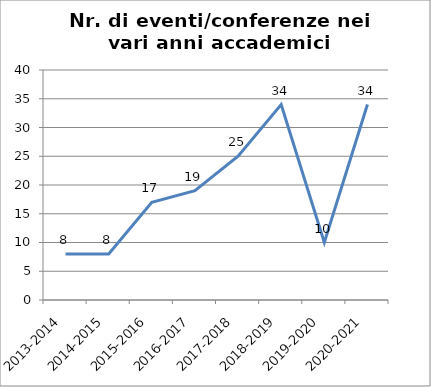
| Category | Nr. Eventi/Conferenze |
|---|---|
| 2013-2014 | 8 |
| 2014-2015 | 8 |
| 2015-2016 | 17 |
| 2016-2017 | 19 |
| 2017-2018 | 25 |
| 2018-2019 | 34 |
| 2019-2020 | 10 |
| 2020-2021 | 34 |